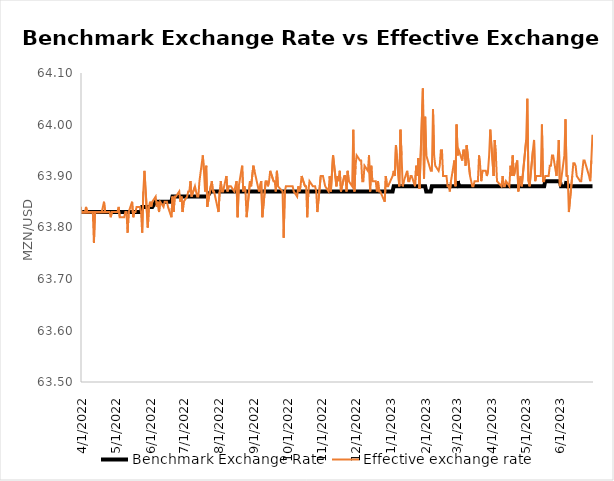
| Category | Benchmark Exchange Rate | Effective exchange rate |
|---|---|---|
| 10/1/21 | 63.83 | 63.8 |
| 10/5/21 | 63.83 | 63.83 |
| 10/6/21 | 63.83 | 63.76 |
| 10/7/21 | 63.83 | 63.82 |
| 10/8/21 | 63.83 | 63.82 |
| 10/11/21 | 63.83 | 63.77 |
| 10/12/21 | 63.83 | 63.81 |
| 10/13/21 | 63.83 | 63.82 |
| 10/14/21 | 63.83 | 63.82 |
| 10/15/21 | 63.83 | 63.82 |
| 10/18/21 | 63.83 | 63.76 |
| 10/19/21 | 63.83 | 63.76 |
| 10/20/21 | 63.83 | 63.82 |
| 10/21/21 | 63.83 | 63.78 |
| 10/22/21 | 63.83 | 63.81 |
| 10/25/21 | 63.83 | 63.82 |
| 10/26/21 | 63.83 | 63.79 |
| 10/27/21 | 63.83 | 63.8 |
| 10/28/21 | 63.83 | 63.83 |
| 10/29/21 | 63.83 | 63.82 |
| 11/1/21 | 63.83 | 63.84 |
| 11/2/21 | 63.83 | 63.81 |
| 11/3/21 | 63.83 | 63.83 |
| 11/4/21 | 63.83 | 63.82 |
| 11/5/21 | 63.83 | 63.83 |
| 11/8/21 | 63.83 | 63.79 |
| 11/9/21 | 63.83 | 63.79 |
| 11/11/21 | 63.83 | 63.84 |
| 11/12/21 | 63.83 | 63.83 |
| 11/15/21 | 63.83 | 63.78 |
| 11/16/21 | 63.83 | 63.7 |
| 11/17/21 | 63.83 | 63.84 |
| 11/18/21 | 63.83 | 63.81 |
| 11/19/21 | 63.83 | 63.8 |
| 11/22/21 | 63.83 | 63.78 |
| 11/23/21 | 63.83 | 63.81 |
| 11/24/21 | 63.83 | 63.81 |
| 11/25/21 | 63.83 | 63.81 |
| 11/26/21 | 63.83 | 63.84 |
| 11/29/21 | 63.83 | 63.8 |
| 11/30/21 | 63.83 | 63.81 |
| 12/1/21 | 63.83 | 63.79 |
| 12/2/21 | 63.83 | 63.79 |
| 12/3/21 | 63.83 | 63.82 |
| 12/6/21 | 63.83 | 63.75 |
| 12/7/21 | 63.83 | 63.78 |
| 12/8/21 | 63.83 | 63.82 |
| 12/9/21 | 63.83 | 63.82 |
| 12/10/21 | 63.83 | 63.82 |
| 12/13/21 | 63.83 | 63.83 |
| 12/14/21 | 63.83 | 63.76 |
| 12/15/21 | 63.83 | 63.82 |
| 12/16/21 | 63.83 | 63.8 |
| 12/17/21 | 63.83 | 63.79 |
| 12/20/21 | 63.83 | 63.84 |
| 12/21/21 | 63.83 | 63.79 |
| 12/22/21 | 63.83 | 63.8 |
| 12/23/21 | 63.83 | 63.82 |
| 12/27/21 | 63.83 | 63.77 |
| 12/28/21 | 63.83 | 63.74 |
| 12/29/21 | 63.83 | 63.76 |
| 12/30/21 | 63.83 | 63.78 |
| 12/31/21 | 63.83 | 63.72 |
| 1/3/22 | 63.83 | 63.79 |
| 1/4/22 | 63.83 | 63.81 |
| 1/5/22 | 63.83 | 63.8 |
| 1/6/22 | 63.83 | 63.81 |
| 1/7/22 | 63.83 | 63.77 |
| 1/10/22 | 63.83 | 63.79 |
| 1/12/22 | 63.83 | 63.83 |
| 1/13/22 | 63.83 | 63.83 |
| 1/14/22 | 63.83 | 63.83 |
| 1/17/22 | 63.83 | 63.83 |
| 1/18/22 | 63.83 | 63.83 |
| 1/19/22 | 63.83 | 63.8 |
| 1/20/22 | 63.83 | 63.83 |
| 1/21/22 | 63.83 | 63.83 |
| 1/24/22 | 63.83 | 63.81 |
| 1/25/22 | 63.83 | 63.82 |
| 1/26/22 | 63.83 | 63.83 |
| 1/27/22 | 63.83 | 63.8 |
| 1/28/22 | 63.83 | 63.83 |
| 1/31/22 | 63.83 | 63.81 |
| 2/1/22 | 63.83 | 63.83 |
| 2/2/22 | 63.83 | 63.82 |
| 2/3/22 | 63.83 | 63.78 |
| 2/4/22 | 63.83 | 63.84 |
| 2/7/22 | 63.83 | 63.83 |
| 2/8/22 | 63.83 | 63.85 |
| 2/9/22 | 63.83 | 63.8 |
| 2/10/22 | 63.83 | 63.83 |
| 2/11/22 | 63.83 | 63.83 |
| 2/14/22 | 63.83 | 63.83 |
| 2/15/22 | 63.83 | 63.81 |
| 2/16/22 | 63.83 | 63.81 |
| 2/17/22 | 63.83 | 63.83 |
| 2/18/22 | 63.83 | 63.83 |
| 2/21/22 | 63.83 | 63.84 |
| 2/22/22 | 63.83 | 63.83 |
| 2/23/22 | 63.83 | 63.83 |
| 2/24/22 | 63.83 | 63.81 |
| 2/25/22 | 63.83 | 63.82 |
| 2/28/22 | 63.83 | 63.83 |
| 3/1/22 | 63.83 | 63.79 |
| 3/2/22 | 63.83 | 63.81 |
| 3/3/22 | 63.83 | 63.83 |
| 3/4/22 | 63.83 | 63.83 |
| 3/7/22 | 63.83 | 63.82 |
| 3/8/22 | 63.83 | 63.83 |
| 3/9/22 | 63.83 | 63.76 |
| 3/10/22 | 63.83 | 63.82 |
| 3/11/22 | 63.83 | 63.83 |
| 3/14/22 | 63.83 | 63.83 |
| 3/15/22 | 63.83 | 63.82 |
| 3/16/22 | 63.83 | 63.82 |
| 3/17/22 | 63.83 | 63.82 |
| 3/18/22 | 63.83 | 63.84 |
| 3/21/22 | 63.83 | 63.8 |
| 3/22/22 | 63.83 | 63.8 |
| 3/23/22 | 63.83 | 63.82 |
| 3/24/22 | 63.83 | 63.84 |
| 3/25/22 | 63.83 | 63.83 |
| 3/28/22 | 63.83 | 63.73 |
| 3/29/22 | 63.83 | 63.88 |
| 3/30/22 | 63.83 | 63.82 |
| 3/31/22 | 63.83 | 63.84 |
| 4/1/22 | 63.83 | 63.83 |
| 4/4/22 | 63.83 | 63.83 |
| 4/5/22 | 63.83 | 63.84 |
| 4/6/22 | 63.83 | 63.83 |
| 4/8/22 | 63.83 | 63.83 |
| 4/11/22 | 63.83 | 63.83 |
| 4/12/22 | 63.83 | 63.77 |
| 4/13/22 | 63.83 | 63.83 |
| 4/14/22 | 63.83 | 63.83 |
| 4/18/22 | 63.83 | 63.83 |
| 4/19/22 | 63.83 | 63.83 |
| 4/20/22 | 63.83 | 63.84 |
| 4/21/22 | 63.83 | 63.85 |
| 4/22/22 | 63.83 | 63.83 |
| 4/25/20 | 63.83 | 63.81 |
| 4/26/22 | 63.83 | 63.83 |
| 4/27/22 | 63.83 | 63.82 |
| 4/28/22 | 63.83 | 63.83 |
| 4/29/22 | 63.83 | 63.83 |
| 5/3/22 | 63.83 | 63.83 |
| 5/4/22 | 63.83 | 63.84 |
| 5/5/22 | 63.83 | 63.82 |
| 5/6/22 | 63.83 | 63.82 |
| 5/9/22 | 63.83 | 63.82 |
| 5/10/22 | 63.83 | 63.83 |
| 5/11/22 | 63.83 | 63.83 |
| 5/12/22 | 63.83 | 63.79 |
| 5/13/22 | 63.83 | 63.83 |
| 5/16/22 | 63.83 | 63.85 |
| 5/17/22 | 63.83 | 63.82 |
| 5/18/22 | 63.83 | 63.83 |
| 5/19/22 | 63.83 | 63.83 |
| 5/20/22 | 63.83 | 63.84 |
| 5/23/22 | 63.83 | 63.84 |
| 5/24/22 | 63.83 | 63.83 |
| 5/25/22 | 63.84 | 63.79 |
| 5/26/22 | 63.84 | 63.87 |
| 5/27/22 | 63.84 | 63.91 |
| 5/30/22 | 63.84 | 63.8 |
| 5/31/22 | 63.84 | 63.84 |
| 6/1/22 | 63.84 | 63.85 |
| 6/2/22 | 63.84 | 63.84 |
| 6/3/22 | 63.84 | 63.85 |
| 6/6/22 | 63.85 | 63.86 |
| 6/7/22 | 63.85 | 63.84 |
| 6/8/22 | 63.85 | 63.85 |
| 6/9/22 | 63.85 | 63.83 |
| 6/10/22 | 63.85 | 63.85 |
| 6/13/22 | 63.85 | 63.84 |
| 6/14/22 | 63.85 | 63.85 |
| 6/15/22 | 63.85 | 63.85 |
| 6/16/22 | 63.85 | 63.85 |
| 6/17/22 | 63.85 | 63.84 |
| 6/20/22 | 63.85 | 63.82 |
| 6/21/22 | 63.86 | 63.86 |
| 6/22/22 | 63.86 | 63.83 |
| 6/23/22 | 63.86 | 63.86 |
| 6/24/22 | 63.86 | 63.86 |
| 6/27/22 | 63.86 | 63.87 |
| 6/28/22 | 63.86 | 63.85 |
| 6/29/22 | 63.86 | 63.86 |
| 6/30/22 | 63.86 | 63.83 |
| 7/1/22 | 63.86 | 63.85 |
| 7/4/22 | 63.86 | 63.86 |
| 7/5/22 | 63.86 | 63.87 |
| 7/6/22 | 63.86 | 63.87 |
| 7/7/22 | 63.86 | 63.89 |
| 7/8/22 | 63.86 | 63.86 |
| 7/11/22 | 63.86 | 63.88 |
| 7/12/22 | 63.86 | 63.87 |
| 7/13/22 | 63.86 | 63.86 |
| 7/14/22 | 63.86 | 63.86 |
| 7/15/22 | 63.86 | 63.89 |
| 7/18/22 | 63.86 | 63.94 |
| 7/19/22 | 63.86 | 63.91 |
| 7/20/22 | 63.86 | 63.87 |
| 7/21/22 | 63.86 | 63.92 |
| 7/22/22 | 63.86 | 63.84 |
| 7/25/22 | 63.87 | 63.88 |
| 7/26/22 | 63.87 | 63.89 |
| 7/27/22 | 63.87 | 63.87 |
| 7/28/22 | 63.87 | 63.87 |
| 7/29/22 | 63.87 | 63.86 |
| 8/1/22 | 63.87 | 63.83 |
| 8/2/22 | 63.87 | 63.87 |
| 8/3/22 | 63.87 | 63.89 |
| 8/4/22 | 63.87 | 63.87 |
| 8/5/22 | 63.87 | 63.87 |
| 8/8/22 | 63.87 | 63.9 |
| 8/9/22 | 63.87 | 63.87 |
| 8/10/22 | 63.87 | 63.88 |
| 8/11/22 | 63.87 | 63.88 |
| 8/12/22 | 63.87 | 63.88 |
| 8/15/22 | 63.87 | 63.87 |
| 8/16/22 | 63.87 | 63.88 |
| 8/17/22 | 63.87 | 63.89 |
| 8/18/22 | 63.87 | 63.82 |
| 8/19/22 | 63.87 | 63.88 |
| 8/22/22 | 63.87 | 63.92 |
| 8/23/22 | 63.87 | 63.87 |
| 8/24/22 | 63.87 | 63.88 |
| 8/25/22 | 63.87 | 63.87 |
| 8/26/22 | 63.87 | 63.82 |
| 8/29/22 | 63.87 | 63.89 |
| 8/30/22 | 63.87 | 63.88 |
| 9/1/22 | 63.87 | 63.92 |
| 9/2/22 | 63.87 | 63.91 |
| 9/5/22 | 63.87 | 63.88 |
| 9/6/22 | 63.87 | 63.87 |
| 9/8/22 | 63.87 | 63.89 |
| 9/9/22 | 63.87 | 63.82 |
| 9/12/22 | 63.87 | 63.89 |
| 9/13/22 | 63.87 | 63.89 |
| 9/14/22 | 63.87 | 63.88 |
| 9/15/22 | 63.87 | 63.89 |
| 9/16/22 | 63.87 | 63.91 |
| 9/19/22 | 63.87 | 63.89 |
| 9/20/22 | 63.87 | 63.89 |
| 9/21/22 | 63.87 | 63.87 |
| 9/22/22 | 63.87 | 63.91 |
| 9/23/22 | 63.87 | 63.88 |
| 9/27/22 | 63.87 | 63.87 |
| 9/28/22 | 63.87 | 63.78 |
| 9/29/22 | 63.87 | 63.87 |
| 9/30/22 | 63.87 | 63.88 |
| 10/3/22 | 63.87 | 63.88 |
| 10/5/22 | 63.87 | 63.88 |
| 10/6/22 | 63.87 | 63.88 |
| 10/7/22 | 63.87 | 63.87 |
| 10/10/22 | 63.87 | 63.86 |
| 10/11/22 | 63.87 | 63.88 |
| 10/12/22 | 63.87 | 63.87 |
| 10/13/22 | 63.87 | 63.88 |
| 10/14/22 | 63.87 | 63.9 |
| 10/17/22 | 63.87 | 63.88 |
| 10/18/22 | 63.87 | 63.88 |
| 10/19/22 | 63.87 | 63.82 |
| 10/20/22 | 63.87 | 63.87 |
| 10/21/22 | 63.87 | 63.89 |
| 10/24/22 | 63.87 | 63.88 |
| 10/25/22 | 63.87 | 63.88 |
| 10/26/22 | 63.87 | 63.88 |
| 10/27/22 | 63.87 | 63.87 |
| 10/28/22 | 63.87 | 63.83 |
| 10/31/22 | 63.87 | 63.9 |
| 11/1/22 | 63.87 | 63.9 |
| 11/2/22 | 63.87 | 63.9 |
| 11/3/22 | 63.87 | 63.89 |
| 11/4/22 | 63.87 | 63.88 |
| 11/7/22 | 63.87 | 63.87 |
| 11/8/22 | 63.87 | 63.9 |
| 11/9/22 | 63.87 | 63.87 |
| 11/11/22 | 63.87 | 63.94 |
| 11/14/22 | 63.87 | 63.88 |
| 11/15/22 | 63.87 | 63.9 |
| 11/16/22 | 63.87 | 63.89 |
| 11/17/22 | 63.87 | 63.91 |
| 11/18/22 | 63.87 | 63.87 |
| 11/21/22 | 63.87 | 63.9 |
| 11/22/22 | 63.87 | 63.9 |
| 11/23/22 | 63.87 | 63.87 |
| 11/24/22 | 63.87 | 63.91 |
| 11/25/22 | 63.87 | 63.89 |
| 11/28/22 | 63.87 | 63.88 |
| 11/29/22 | 63.87 | 63.99 |
| 11/30/22 | 63.87 | 63.87 |
| 12/1/22 | 63.87 | 63.92 |
| 12/2/22 | 63.87 | 63.94 |
| 12/5/22 | 63.87 | 63.93 |
| 12/6/22 | 63.87 | 63.93 |
| 12/7/22 | 63.87 | 63.89 |
| 12/8/22 | 63.87 | 63.89 |
| 12/9/22 | 63.87 | 63.92 |
| 12/12/22 | 63.87 | 63.91 |
| 12/13/22 | 63.87 | 63.94 |
| 12/14/22 | 63.87 | 63.87 |
| 12/15/22 | 63.87 | 63.92 |
| 12/16/22 | 63.87 | 63.89 |
| 12/19/22 | 63.87 | 63.89 |
| 12/20/22 | 63.87 | 63.87 |
| 12/21/22 | 63.87 | 63.89 |
| 12/22/22 | 63.87 | 63.87 |
| 12/23/22 | 63.87 | 63.87 |
| 12/27/22 | 63.87 | 63.85 |
| 12/28/22 | 63.87 | 63.9 |
| 12/29/22 | 63.87 | 63.88 |
| 12/30/22 | 63.87 | 63.88 |
| 1/3/23 | 63.87 | 63.9 |
| 1/4/23 | 63.88 | 63.91 |
| 1/5/23 | 63.88 | 63.9 |
| 1/6/23 | 63.88 | 63.96 |
| 1/9/23 | 63.88 | 63.88 |
| 1/10/23 | 63.88 | 63.99 |
| 1/11/23 | 63.88 | 63.94 |
| 1/12/23 | 63.88 | 63.88 |
| 1/13/23 | 63.88 | 63.89 |
| 1/16/23 | 63.88 | 63.91 |
| 1/17/23 | 63.88 | 63.89 |
| 1/18/23 | 63.88 | 63.89 |
| 1/19/23 | 63.88 | 63.9 |
| 1/20/23 | 63.88 | 63.9 |
| 1/23/23 | 63.88 | 63.88 |
| 1/24/23 | 63.88 | 63.92 |
| 1/25/23 | 63.88 | 63.9 |
| 1/26/23 | 63.88 | 63.935 |
| 1/27/23 | 63.88 | 63.875 |
| 1/30/23 | 63.88 | 64.07 |
| 1/31/23 | 63.88 | 63.895 |
| 2/1/23 | 63.88 | 64.015 |
| 2/2/23 | 63.87 | 63.94 |
| 2/6/23 | 63.87 | 63.91 |
| 2/7/23 | 63.88 | 63.91 |
| 2/8/23 | 63.88 | 64.03 |
| 2/9/23 | 63.88 | 63.94 |
| 2/10/23 | 63.88 | 63.92 |
| 2/13/23 | 63.88 | 63.91 |
| 2/14/23 | 63.88 | 63.92 |
| 2/15/23 | 63.88 | 63.95 |
| 2/16/23 | 63.88 | 63.95 |
| 2/17/23 | 63.88 | 63.9 |
| 2/20/23 | 63.88 | 63.9 |
| 2/21/23 | 63.88 | 63.88 |
| 2/22/23 | 63.88 | 63.88 |
| 2/23/23 | 63.88 | 63.87 |
| 2/24/23 | 63.88 | 63.89 |
| 2/27/23 | 63.88 | 63.93 |
| 2/28/23 | 63.88 | 63.88 |
| 3/1/23 | 63.88 | 64 |
| 3/2/23 | 63.89 | 63.94 |
| 3/3/23 | 63.88 | 63.95 |
| 3/6/23 | 63.88 | 63.93 |
| 3/7/23 | 63.88 | 63.95 |
| 3/8/23 | 63.88 | 63.95 |
| 3/9/23 | 63.88 | 63.92 |
| 3/10/23 | 63.88 | 63.96 |
| 3/13/23 | 63.88 | 63.9 |
| 3/14/23 | 63.88 | 63.89 |
| 3/15/23 | 63.88 | 63.88 |
| 3/16/23 | 63.88 | 63.88 |
| 3/17/23 | 63.88 | 63.89 |
| 3/20/23 | 63.88 | 63.89 |
| 3/21/23 | 63.88 | 63.94 |
| 3/22/23 | 63.88 | 63.92 |
| 3/23/23 | 63.88 | 63.89 |
| 3/24/23 | 63.88 | 63.91 |
| 3/27/23 | 63.88 | 63.91 |
| 3/28/23 | 63.88 | 63.9 |
| 3/29/23 | 63.88 | 63.91 |
| 3/30/23 | 63.88 | 63.94 |
| 3/31/23 | 63.88 | 63.99 |
| 4/3/23 | 63.88 | 63.9 |
| 4/4/23 | 63.88 | 63.97 |
| 4/5/23 | 63.88 | 63.94 |
| 4/6/23 | 63.88 | 63.89 |
| 4/10/23 | 63.88 | 63.88 |
| 4/11/23 | 63.88 | 63.9 |
| 4/12/23 | 63.88 | 63.88 |
| 4/13/23 | 63.88 | 63.88 |
| 4/14/23 | 63.88 | 63.89 |
| 4/17/23 | 63.88 | 63.88 |
| 4/18/23 | 63.88 | 63.92 |
| 4/19/23 | 63.88 | 63.9 |
| 4/20/23 | 63.88 | 63.94 |
| 4/21/23 | 63.88 | 63.9 |
| 4/24/23 | 63.88 | 63.93 |
| 4/25/23 | 63.88 | 63.87 |
| 4/26/23 | 63.88 | 63.89 |
| 4/27/23 | 63.88 | 63.9 |
| 4/28/23 | 63.88 | 63.88 |
| 5/2/23 | 63.88 | 63.97 |
| 5/3/23 | 63.88 | 64.05 |
| 5/4/23 | 63.88 | 63.89 |
| 5/5/23 | 63.88 | 63.88 |
| 5/8/23 | 63.88 | 63.95 |
| 5/9/23 | 63.88 | 63.97 |
| 5/10/23 | 63.88 | 63.89 |
| 5/11/23 | 63.88 | 63.9 |
| 5/12/23 | 63.88 | 63.9 |
| 5/15/23 | 63.88 | 63.9 |
| 5/16/23 | 63.88 | 64 |
| 5/17/23 | 63.88 | 63.89 |
| 5/18/23 | 63.88 | 63.89 |
| 5/19/23 | 63.89 | 63.9 |
| 5/22/23 | 63.89 | 63.9 |
| 5/23/23 | 63.89 | 63.92 |
| 5/24/23 | 63.89 | 63.92 |
| 5/25/23 | 63.89 | 63.94 |
| 5/26/23 | 63.89 | 63.94 |
| 5/29/23 | 63.89 | 63.9 |
| 5/30/23 | 63.89 | 63.93 |
| 5/31/23 | 63.89 | 63.97 |
| 6/1/23 | 63.89 | 63.88 |
| 6/2/23 | 63.88 | 63.89 |
| 6/5/23 | 63.88 | 63.94 |
| 6/6/23 | 63.88 | 64.01 |
| 6/7/23 | 63.89 | 63.9 |
| 6/8/23 | 63.88 | 63.9 |
| 6/9/23 | 63.88 | 63.83 |
| 6/12/23 | 63.88 | 63.9 |
| 6/13/23 | 63.88 | 63.925 |
| 6/14/23 | 63.88 | 63.925 |
| 6/15/23 | 63.88 | 63.92 |
| 6/16/23 | 63.88 | 63.9 |
| 6/19/23 | 63.88 | 63.89 |
| 6/20/23 | 63.88 | 63.89 |
| 6/21/23 | 63.88 | 63.91 |
| 6/22/23 | 63.88 | 63.93 |
| 6/23/23 | 63.88 | 63.93 |
| 6/27/23 | 63.88 | 63.9 |
| 6/28/23 | 63.88 | 63.89 |
| 6/29/23 | 63.88 | 63.93 |
| 6/30/23 | 63.88 | 63.98 |